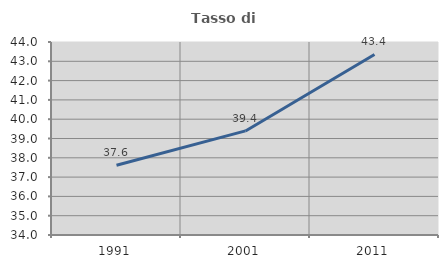
| Category | Tasso di occupazione   |
|---|---|
| 1991.0 | 37.611 |
| 2001.0 | 39.393 |
| 2011.0 | 43.356 |